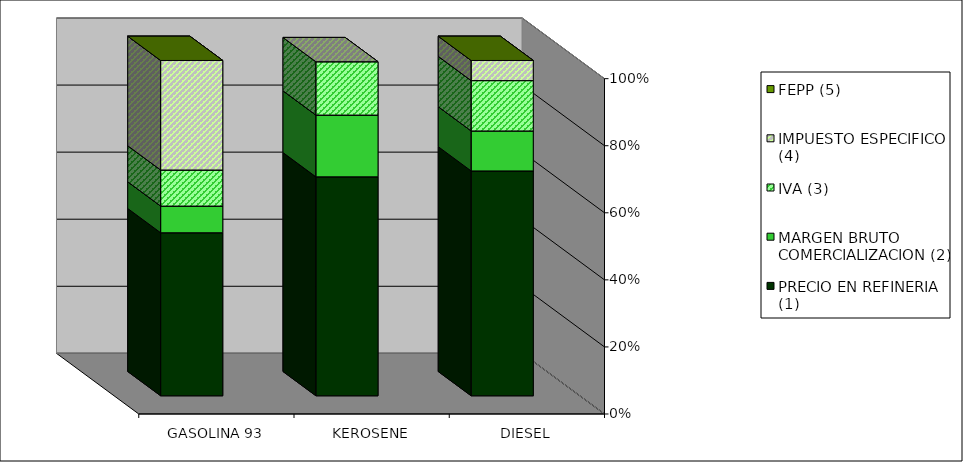
| Category | PRECIO EN REFINERIA (1) | MARGEN BRUTO COMERCIALIZACION (2) | IVA (3) | IMPUESTO ESPECIFICO (4) | FEPP (5) |
|---|---|---|---|---|---|
| GASOLINA 93 | 0.486 | 0.08 | 0.108 | 0.327 | 0 |
| KEROSENE | 0.658 | 0.186 | 0.16 | 0 | -0.004 |
| DIESEL | 0.671 | 0.119 | 0.15 | 0.06 | 0 |